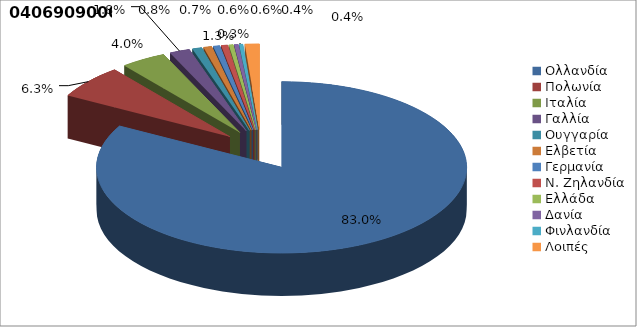
| Category | Series 0 |
|---|---|
| Ολλανδία | 0.83 |
| Πολωνία | 0.063 |
| Ιταλία | 0.04 |
| Γαλλία | 0.018 |
| Ουγγαρία | 0.008 |
| Ελβετία | 0.007 |
| Γερμανία | 0.006 |
| Ν. Ζηλανδία | 0.006 |
| Ελλάδα | 0.004 |
| Δανία | 0.004 |
| Φινλανδία | 0.003 |
| Λοιπές | 0.013 |